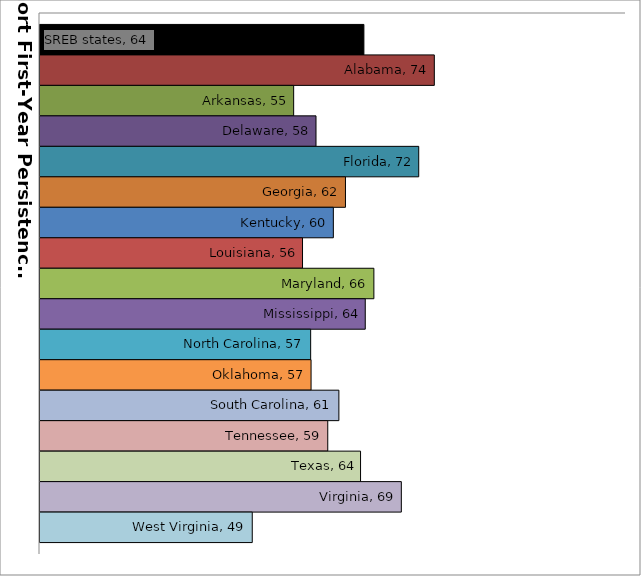
| Category | SREB states | Alabama | Arkansas | Delaware | Florida | Georgia | Kentucky | Louisiana | Maryland | Mississippi | North Carolina | Oklahoma | South Carolina | Tennessee | Texas | Virginia | West Virginia |
|---|---|---|---|---|---|---|---|---|---|---|---|---|---|---|---|---|---|
| 0 | 64.217 | 73.832 | 54.63 | 57.68 | 71.704 | 61.702 | 60.048 | 55.839 | 65.581 | 64.404 | 56.95 | 57.006 | 60.802 | 59.285 | 63.763 | 69.329 | 48.977 |